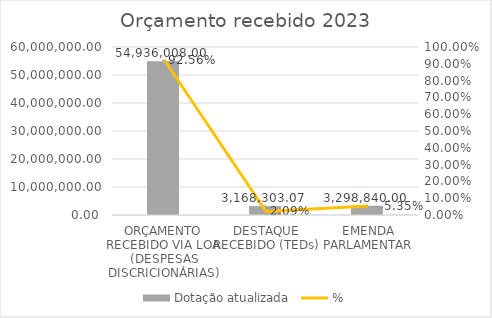
| Category | Dotação atualizada |
|---|---|
| ORÇAMENTO RECEBIDO VIA LOA (DESPESAS DISCRICIONÁRIAS) | 54936008 |
| DESTAQUE RECEBIDO (TEDs) | 3168303.07 |
| EMENDA PARLAMENTAR | 3298840 |